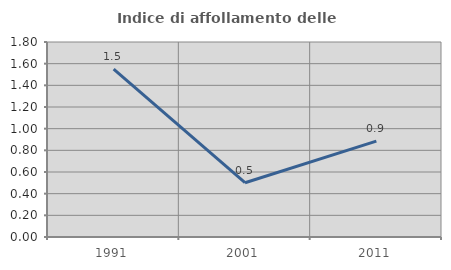
| Category | Indice di affollamento delle abitazioni  |
|---|---|
| 1991.0 | 1.549 |
| 2001.0 | 0.501 |
| 2011.0 | 0.885 |